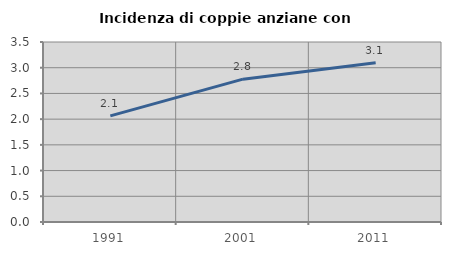
| Category | Incidenza di coppie anziane con figli |
|---|---|
| 1991.0 | 2.064 |
| 2001.0 | 2.778 |
| 2011.0 | 3.097 |